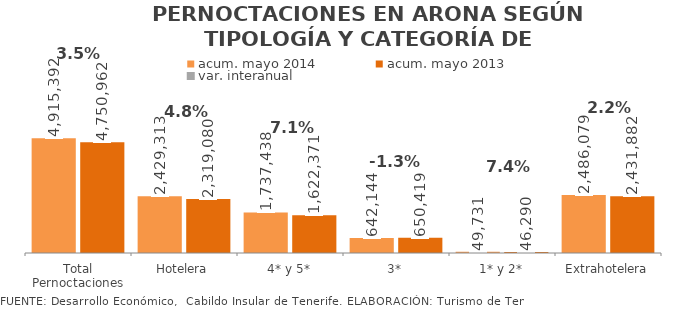
| Category | acum. mayo 2014 | acum. mayo 2013 |
|---|---|---|
| Total Pernoctaciones | 4915392 | 4750962 |
| Hotelera | 2429313 | 2319080 |
| 4* y 5* | 1737438 | 1622371 |
| 3* | 642144 | 650419 |
| 1* y 2* | 49731 | 46290 |
| Extrahotelera | 2486079 | 2431882 |